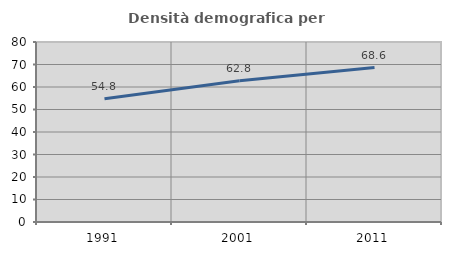
| Category | Densità demografica |
|---|---|
| 1991.0 | 54.785 |
| 2001.0 | 62.795 |
| 2011.0 | 68.623 |